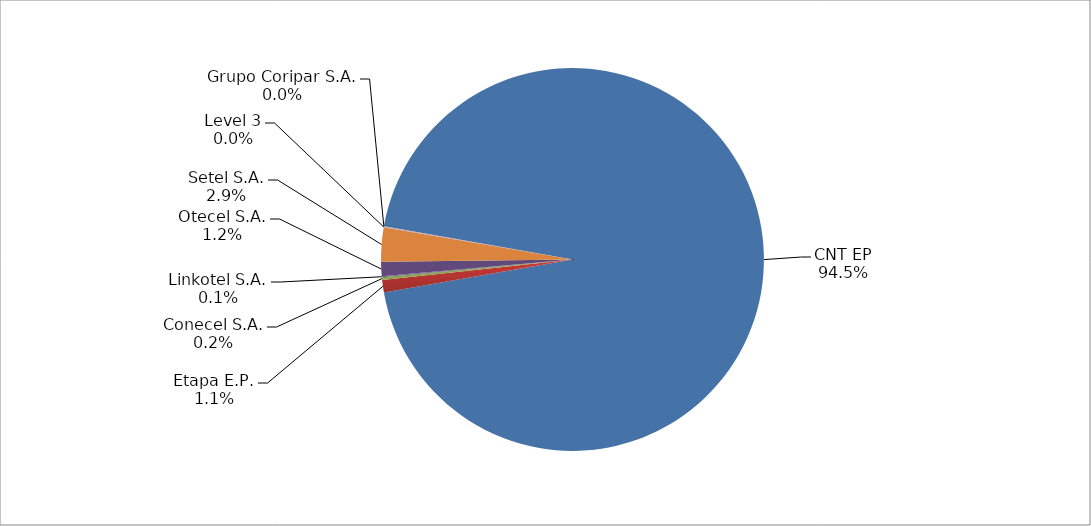
| Category | Series 0 |
|---|---|
| CNT EP | 2130 |
| Etapa E.P. | 24 |
| Conecel S.A. | 5 |
| Linkotel S.A. | 2 |
| Otecel S.A. | 27 |
| Setel S.A. | 65 |
| Level 3 | 1 |
| Grupo Coripar S.A. | 1 |